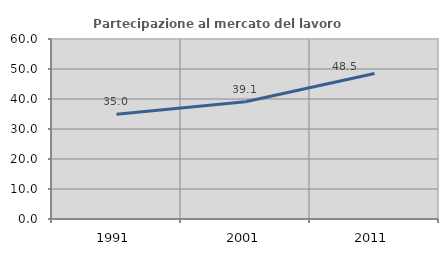
| Category | Partecipazione al mercato del lavoro  femminile |
|---|---|
| 1991.0 | 34.951 |
| 2001.0 | 39.091 |
| 2011.0 | 48.515 |